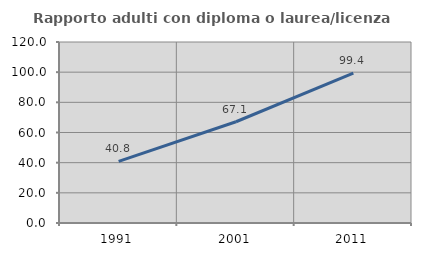
| Category | Rapporto adulti con diploma o laurea/licenza media  |
|---|---|
| 1991.0 | 40.827 |
| 2001.0 | 67.127 |
| 2011.0 | 99.419 |